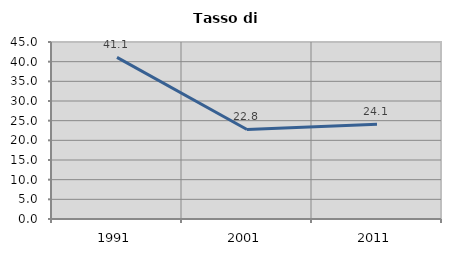
| Category | Tasso di disoccupazione   |
|---|---|
| 1991.0 | 41.104 |
| 2001.0 | 22.761 |
| 2011.0 | 24.066 |